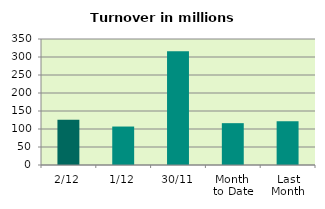
| Category | Series 0 |
|---|---|
| 2/12 | 125.593 |
| 1/12 | 106.842 |
| 30/11 | 315.643 |
| Month 
to Date | 116.217 |
| Last
Month | 121.455 |